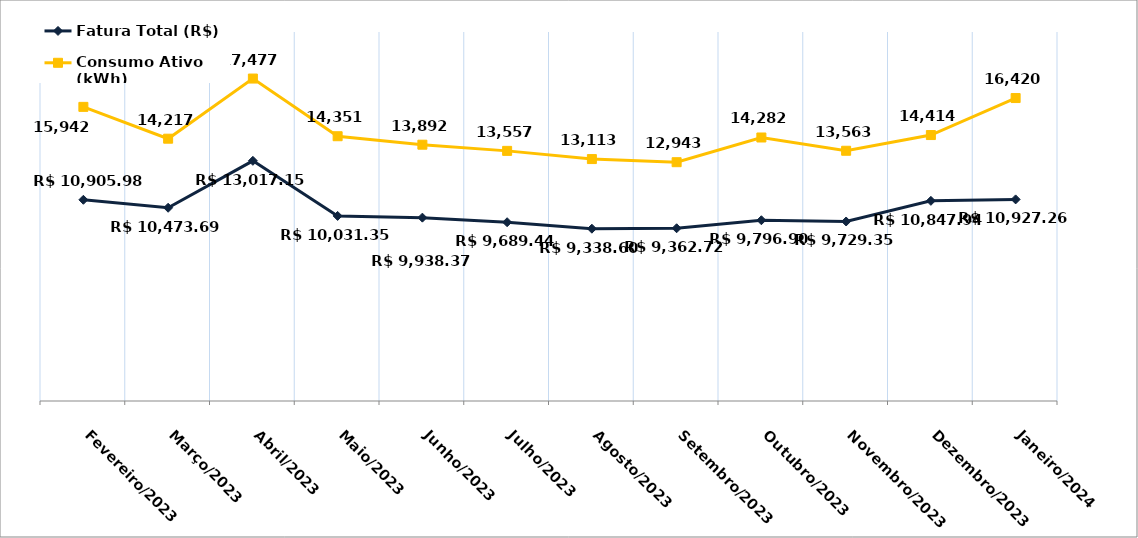
| Category | Fatura Total (R$) | Consumo Ativo (kWh) |
|---|---|---|
| Fevereiro/2023 | 10905.98 | 15942 |
| Março/2023 | 10473.69 | 14217 |
| Abril/2023 | 13017.15 | 17477 |
| Maio/2023 | 10031.35 | 14351 |
| Junho/2023 | 9938.37 | 13892 |
| Julho/2023 | 9689.44 | 13557 |
| Agosto/2023 | 9338.6 | 13113 |
| Setembro/2023 | 9362.72 | 12943 |
| Outubro/2023 | 9796.9 | 14282 |
| Novembro/2023 | 9729.35 | 13563 |
| Dezembro/2023 | 10847.94 | 14414 |
| Janeiro/2024 | 10927.26 | 16420 |